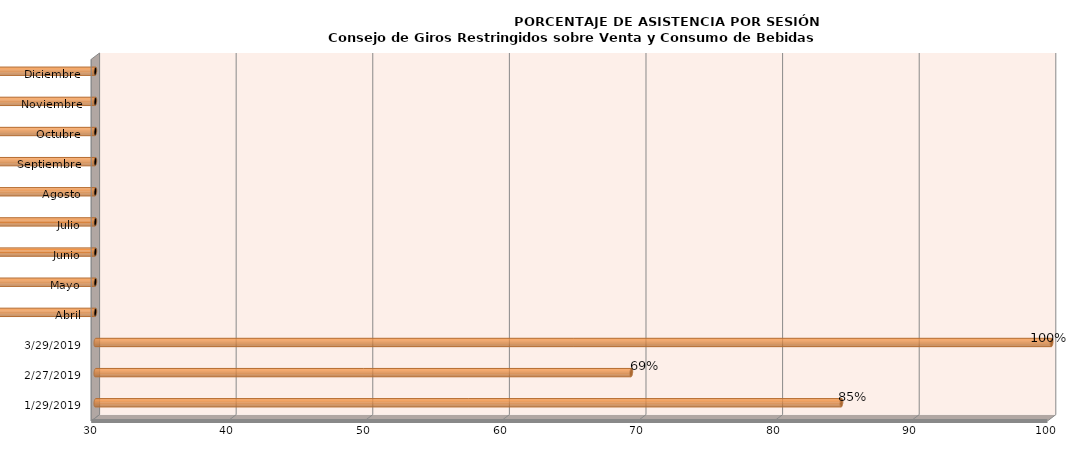
| Category | Series 0 |
|---|---|
| 29/01/2019 | 84.615 |
| 27/02/2019 | 69.231 |
| 29/03/2019 | 100 |
| Abril | 0 |
| Mayo | 0 |
| Junio | 0 |
| Julio | 0 |
| Agosto | 0 |
| Septiembre | 0 |
| Octubre | 0 |
| Noviembre | 0 |
| Diciembre | 0 |